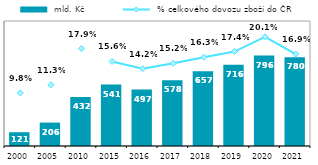
| Category |  mld. Kč |
|---|---|
| 2000.0 | 121.259 |
| 2005.0 | 205.937 |
| 2010.0 | 432.179 |
| 2015.0 | 540.741 |
| 2016.0 | 497.037 |
| 2017.0 | 578.493 |
| 2018.0 | 657.289 |
| 2019.0 | 715.75 |
| 2020.0 | 796.391 |
| 2021.0 | 780.412 |